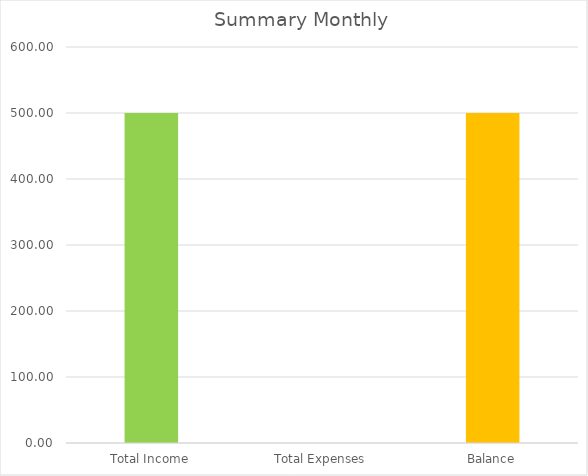
| Category | Montly |
|---|---|
| Total Income | 500 |
| Total Expenses | 0 |
| Balance | 500 |